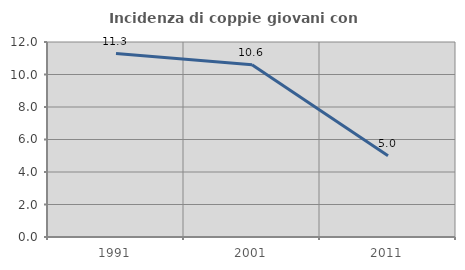
| Category | Incidenza di coppie giovani con figli |
|---|---|
| 1991.0 | 11.29 |
| 2001.0 | 10.606 |
| 2011.0 | 5 |